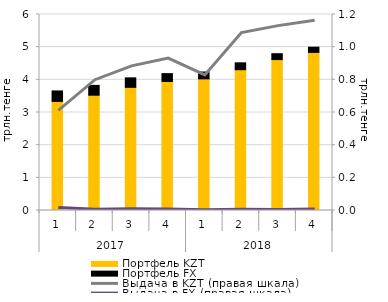
| Category | Портфель KZT | Портфель FX |
|---|---|---|
| 0 | 3.34 | 0.32 |
| 1 | 3.53 | 0.3 |
| 2 | 3.77 | 0.29 |
| 3 | 3.95 | 0.24 |
| 4 | 4.03 | 0.21 |
| 5 | 4.31 | 0.21 |
| 6 | 4.62 | 0.18 |
| 7 | 4.84 | 0.16 |